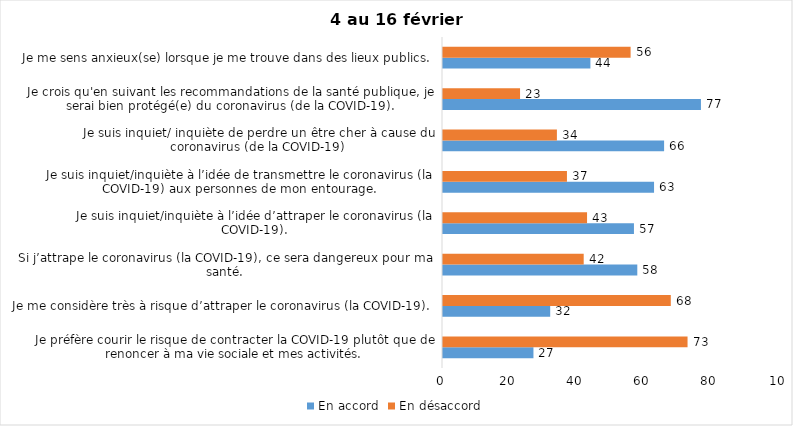
| Category | En accord | En désaccord |
|---|---|---|
| Je préfère courir le risque de contracter la COVID-19 plutôt que de renoncer à ma vie sociale et mes activités. | 27 | 73 |
| Je me considère très à risque d’attraper le coronavirus (la COVID-19). | 32 | 68 |
| Si j’attrape le coronavirus (la COVID-19), ce sera dangereux pour ma santé. | 58 | 42 |
| Je suis inquiet/inquiète à l’idée d’attraper le coronavirus (la COVID-19). | 57 | 43 |
| Je suis inquiet/inquiète à l’idée de transmettre le coronavirus (la COVID-19) aux personnes de mon entourage. | 63 | 37 |
| Je suis inquiet/ inquiète de perdre un être cher à cause du coronavirus (de la COVID-19) | 66 | 34 |
| Je crois qu'en suivant les recommandations de la santé publique, je serai bien protégé(e) du coronavirus (de la COVID-19). | 77 | 23 |
| Je me sens anxieux(se) lorsque je me trouve dans des lieux publics. | 44 | 56 |